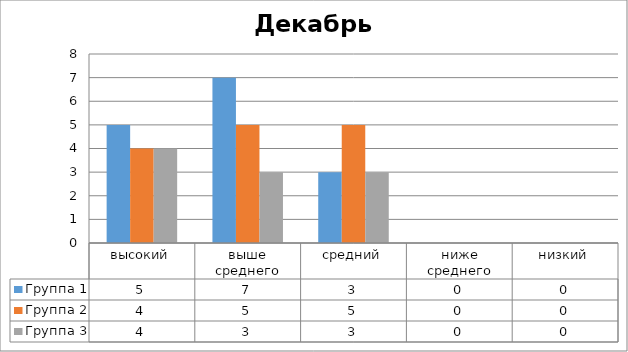
| Category | Группа 1 | Группа 2 | Группа 3 |
|---|---|---|---|
| высокий | 5 | 4 | 4 |
| выше среднего | 7 | 5 | 3 |
| средний | 3 | 5 | 3 |
| ниже среднего | 0 | 0 | 0 |
| низкий | 0 | 0 | 0 |